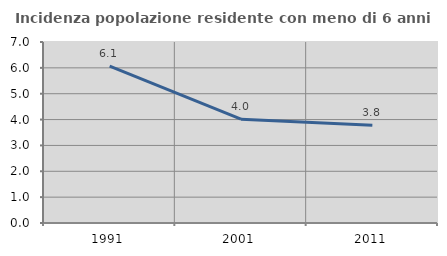
| Category | Incidenza popolazione residente con meno di 6 anni |
|---|---|
| 1991.0 | 6.067 |
| 2001.0 | 4.016 |
| 2011.0 | 3.781 |